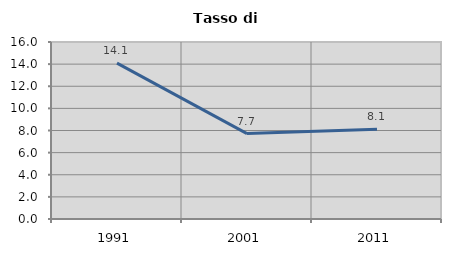
| Category | Tasso di disoccupazione   |
|---|---|
| 1991.0 | 14.089 |
| 2001.0 | 7.721 |
| 2011.0 | 8.106 |